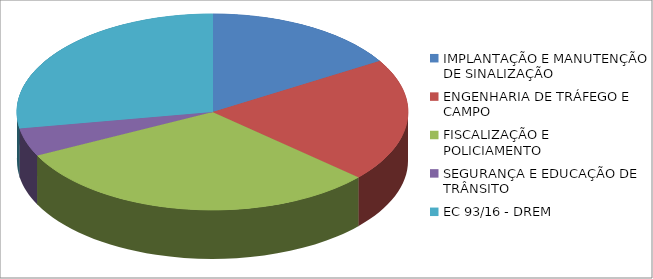
| Category | Series 0 | Series 1 |
|---|---|---|
| IMPLANTAÇÃO E MANUTENÇÃO DE SINALIZAÇÃO | 2203684.96 |  |
| ENGENHARIA DE TRÁFEGO E CAMPO | 2750263.17 |  |
| FISCALIZAÇÃO E POLICIAMENTO | 4204411.46 |  |
| SEGURANÇA E EDUCAÇÃO DE TRÂNSITO | 627539.74 |  |
| EC 93/16 - DREM | 3746469.89 |  |